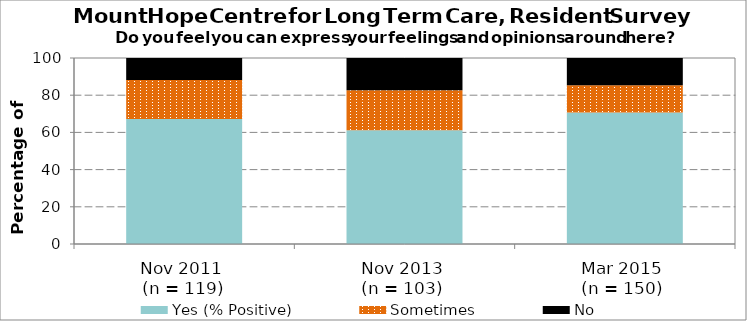
| Category | Yes (% Positive) | Sometimes | No |
|---|---|---|---|
| Nov 2011 
(n = 119) | 67.2 | 21 | 11.8 |
| Nov 2013 
(n = 103)  | 61.2 | 21.4 | 17.5 |
| Mar 2015 
(n = 150)  | 70.7 | 14.7 | 14.7 |